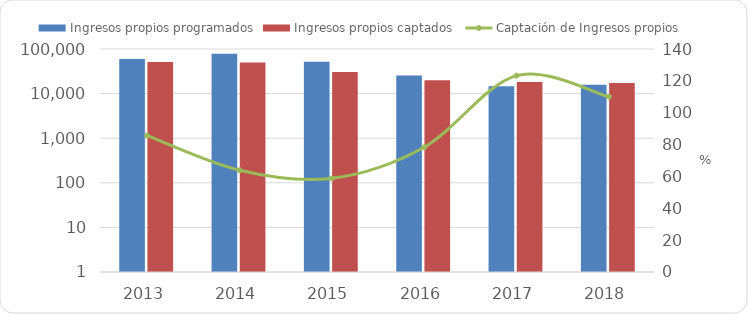
| Category | Ingresos propios programados | Ingresos propios captados  |
|---|---|---|
| 2013 | 59356.6 | 50840.892 |
| 2014 | 77937 | 49810.516 |
| 2015 | 51955.052 | 30547.6 |
| 2016 | 25300.861 | 19808.7 |
| 2017 | 14703.3 | 18126.744 |
| 2018 | 15714.18 | 17287.697 |